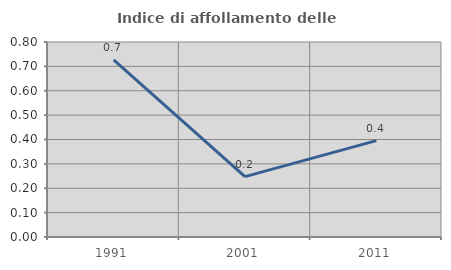
| Category | Indice di affollamento delle abitazioni  |
|---|---|
| 1991.0 | 0.726 |
| 2001.0 | 0.248 |
| 2011.0 | 0.395 |